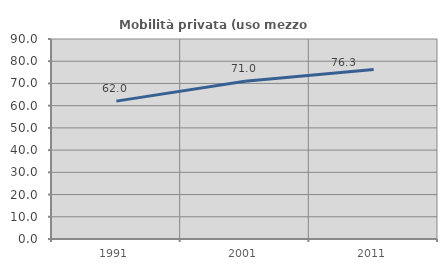
| Category | Mobilità privata (uso mezzo privato) |
|---|---|
| 1991.0 | 62.04 |
| 2001.0 | 70.965 |
| 2011.0 | 76.251 |